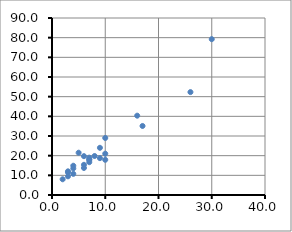
| Category | Series 0 |
|---|---|
| 7.0 | 16.68 |
| 3.0 | 11.5 |
| 3.0 | 12.03 |
| 4.0 | 14.88 |
| 6.0 | 13.75 |
| 7.0 | 18.11 |
| 2.0 | 8 |
| 7.0 | 17.83 |
| 30.0 | 79.24 |
| 5.0 | 21.5 |
| 16.0 | 40.33 |
| 10.0 | 21 |
| 4.0 | 13.5 |
| 6.0 | 19.75 |
| 9.0 | 24 |
| 10.0 | 29 |
| 6.0 | 15.35 |
| 7.0 | 19 |
| 3.0 | 9.5 |
| 17.0 | 35.1 |
| 10.0 | 17.9 |
| 26.0 | 52.32 |
| 9.0 | 18.75 |
| 8.0 | 19.83 |
| 4.0 | 10.75 |